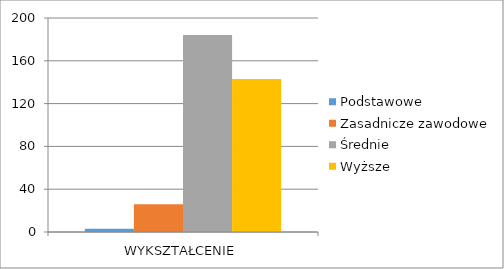
| Category | Podstawowe | Zasadnicze zawodowe | Średnie | Wyższe |
|---|---|---|---|---|
| WYKSZTAŁCENIE | 3 | 26 | 184 | 143 |